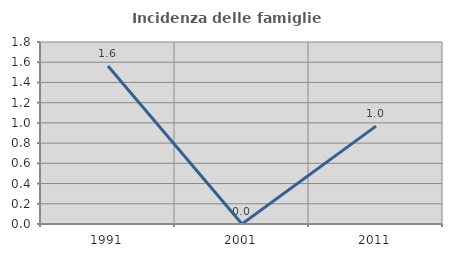
| Category | Incidenza delle famiglie numerose |
|---|---|
| 1991.0 | 1.562 |
| 2001.0 | 0 |
| 2011.0 | 0.968 |